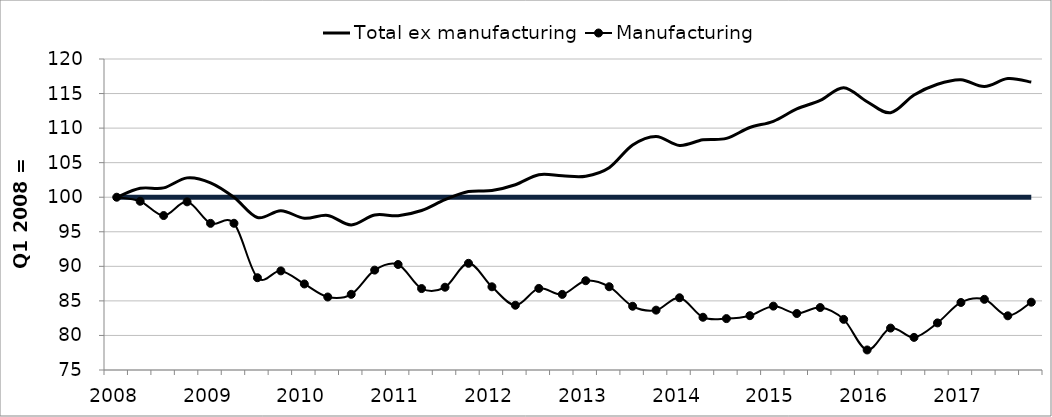
| Category |  Base  |  Total ex manufacturing  |  Manufacturing  |
|---|---|---|---|
| 2008.0 | 100 | 100 | 100 |
| nan | 100 | 101.29 | 99.417 |
| nan | 100 | 101.352 | 97.35 |
| nan | 100 | 102.8 | 99.331 |
| 2009.0 | 100 | 102.09 | 96.219 |
| nan | 100 | 99.99 | 96.233 |
| nan | 100 | 97.063 | 88.354 |
| nan | 100 | 98.056 | 89.341 |
| 2010.0 | 100 | 96.954 | 87.449 |
| nan | 100 | 97.37 | 85.562 |
| nan | 100 | 95.998 | 85.95 |
| nan | 100 | 97.429 | 89.451 |
| 2011.0 | 100 | 97.334 | 90.267 |
| nan | 100 | 98.078 | 86.783 |
| nan | 100 | 99.639 | 86.979 |
| nan | 100 | 100.816 | 90.436 |
| 2012.0 | 100 | 100.974 | 87.038 |
| nan | 100 | 101.803 | 84.37 |
| nan | 100 | 103.265 | 86.807 |
| nan | 100 | 103.107 | 85.941 |
| 2013.0 | 100 | 103.048 | 87.917 |
| nan | 100 | 104.278 | 87.047 |
| nan | 100 | 107.554 | 84.224 |
| nan | 100 | 108.794 | 83.661 |
| 2014.0 | 100 | 107.498 | 85.453 |
| nan | 100 | 108.301 | 82.633 |
| nan | 100 | 108.515 | 82.438 |
| nan | 100 | 110.09 | 82.859 |
| 2015.0 | 100 | 110.988 | 84.242 |
| nan | 100 | 112.774 | 83.173 |
| nan | 100 | 114.016 | 84.038 |
| nan | 100 | 115.848 | 82.326 |
| 2016.0 | 100 | 113.819 | 77.899 |
| nan | 100 | 112.23 | 81.064 |
| nan | 100 | 114.794 | 79.722 |
| nan | 100 | 116.345 | 81.815 |
| 2017.0 | 100 | 117.004 | 84.771 |
| nan | 100 | 116.014 | 85.225 |
| nan | 100 | 117.168 | 82.841 |
| nan | 100 | 116.663 | 84.811 |